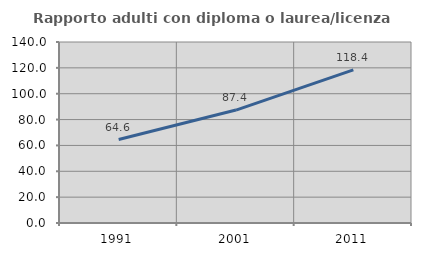
| Category | Rapporto adulti con diploma o laurea/licenza media  |
|---|---|
| 1991.0 | 64.569 |
| 2001.0 | 87.356 |
| 2011.0 | 118.424 |